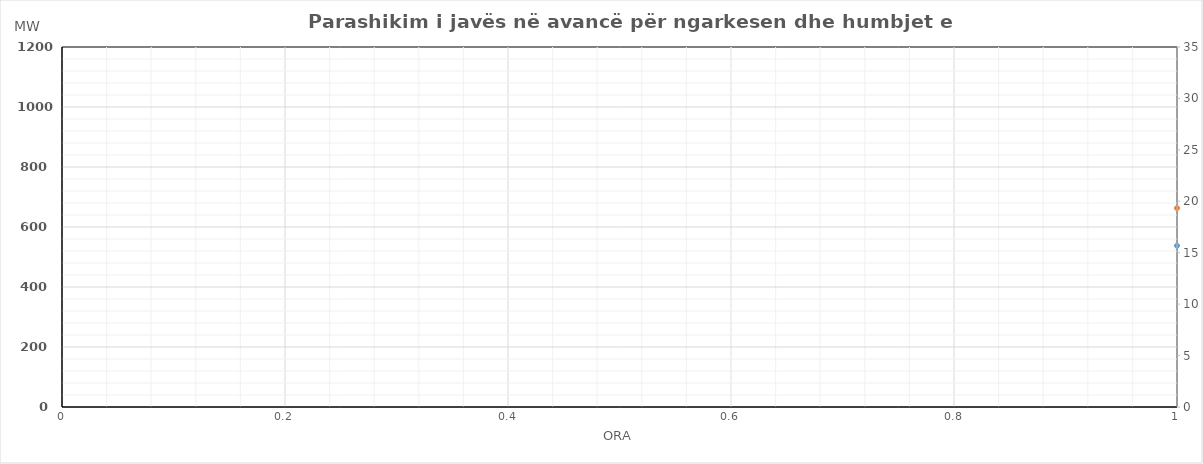
| Category | Ngarkesa (MWh) |
|---|---|
| 0 | 663.025 |
| 1 | 606.61 |
| 2 | 573.08 |
| 3 | 556.521 |
| 4 | 552.995 |
| 5 | 574.631 |
| 6 | 638.052 |
| 7 | 753.085 |
| 8 | 855.382 |
| 9 | 910.074 |
| 10 | 935.221 |
| 11 | 964.887 |
| 12 | 982.958 |
| 13 | 967.806 |
| 14 | 943.359 |
| 15 | 930.177 |
| 16 | 927.437 |
| 17 | 947.383 |
| 18 | 970.015 |
| 19 | 1006.889 |
| 20 | 1043.994 |
| 21 | 963.173 |
| 22 | 864.785 |
| 23 | 761.108 |
| 24 | 609.313 |
| 25 | 559.736 |
| 26 | 534.384 |
| 27 | 524.368 |
| 28 | 528.301 |
| 29 | 562.92 |
| 30 | 634.882 |
| 31 | 775.309 |
| 32 | 879.075 |
| 33 | 916.163 |
| 34 | 931.051 |
| 35 | 946.244 |
| 36 | 945.052 |
| 37 | 962.558 |
| 38 | 949.588 |
| 39 | 933.705 |
| 40 | 921.855 |
| 41 | 914.405 |
| 42 | 933.255 |
| 43 | 972.347 |
| 44 | 998.018 |
| 45 | 910.058 |
| 46 | 806.359 |
| 47 | 708.598 |
| 48 | 658.468 |
| 49 | 603.237 |
| 50 | 573.615 |
| 51 | 556.458 |
| 52 | 553.169 |
| 53 | 577.275 |
| 54 | 648.615 |
| 55 | 762.574 |
| 56 | 862.542 |
| 57 | 902.91 |
| 58 | 922.789 |
| 59 | 944.311 |
| 60 | 958.377 |
| 61 | 942.903 |
| 62 | 915.296 |
| 63 | 896.493 |
| 64 | 891.12 |
| 65 | 901.267 |
| 66 | 917.025 |
| 67 | 967.318 |
| 68 | 1011.126 |
| 69 | 929.484 |
| 70 | 830.206 |
| 71 | 733.831 |
| 72 | 625.59 |
| 73 | 572.917 |
| 74 | 547.719 |
| 75 | 534.791 |
| 76 | 535.587 |
| 77 | 564.194 |
| 78 | 644.576 |
| 79 | 781.904 |
| 80 | 883.876 |
| 81 | 933.024 |
| 82 | 952.39 |
| 83 | 972.656 |
| 84 | 986.129 |
| 85 | 991.735 |
| 86 | 971.653 |
| 87 | 947.04 |
| 88 | 931.801 |
| 89 | 937.389 |
| 90 | 938.495 |
| 91 | 971.748 |
| 92 | 979.383 |
| 93 | 895.759 |
| 94 | 783.044 |
| 95 | 687.052 |
| 96 | 623.448 |
| 97 | 570.287 |
| 98 | 543.271 |
| 99 | 529.631 |
| 100 | 530.217 |
| 101 | 556.22 |
| 102 | 621.038 |
| 103 | 737.312 |
| 104 | 837.92 |
| 105 | 884.802 |
| 106 | 901.644 |
| 107 | 920.081 |
| 108 | 930.677 |
| 109 | 918.113 |
| 110 | 896.642 |
| 111 | 881.523 |
| 112 | 879.419 |
| 113 | 882.012 |
| 114 | 909.071 |
| 115 | 957.188 |
| 116 | 995.119 |
| 117 | 911.88 |
| 118 | 814.976 |
| 119 | 726.443 |
| 120 | 650.055 |
| 121 | 596.733 |
| 122 | 566.15 |
| 123 | 549.515 |
| 124 | 547.311 |
| 125 | 570.501 |
| 126 | 638.77 |
| 127 | 758.092 |
| 128 | 862.931 |
| 129 | 914.318 |
| 130 | 934.634 |
| 131 | 947.778 |
| 132 | 941.034 |
| 133 | 935.529 |
| 134 | 902.564 |
| 135 | 882.911 |
| 136 | 884.676 |
| 137 | 904.717 |
| 138 | 938.51 |
| 139 | 969.233 |
| 140 | 1001.84 |
| 141 | 930.48 |
| 142 | 826.902 |
| 143 | 726.929 |
| 144 | 638.348 |
| 145 | 583.698 |
| 146 | 560.888 |
| 147 | 546.306 |
| 148 | 545.738 |
| 149 | 574.257 |
| 150 | 655.314 |
| 151 | 785.777 |
| 152 | 889.614 |
| 153 | 933.391 |
| 154 | 956.429 |
| 155 | 982.775 |
| 156 | 995.758 |
| 157 | 997.96 |
| 158 | 976.091 |
| 159 | 959.377 |
| 160 | 953.738 |
| 161 | 968.157 |
| 162 | 989.124 |
| 163 | 1013.95 |
| 164 | 1051.11 |
| 165 | 973.238 |
| 166 | 866.965 |
| 167 | 762.841 |